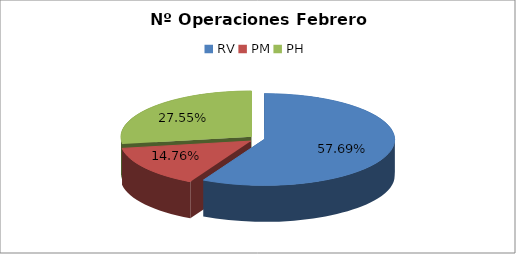
| Category | Series 0 |
|---|---|
| RV | 18527 |
| PM | 4739 |
| PH | 8846 |